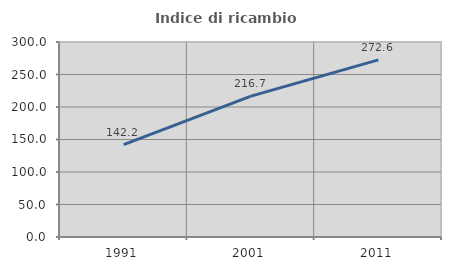
| Category | Indice di ricambio occupazionale  |
|---|---|
| 1991.0 | 142.157 |
| 2001.0 | 216.667 |
| 2011.0 | 272.581 |